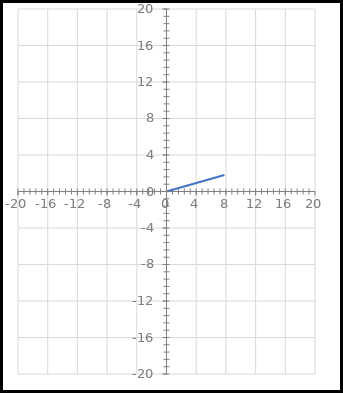
| Category | VetorC |
|---|---|
| 0.0 | 0 |
| 7.794960518280555 | 1.8 |